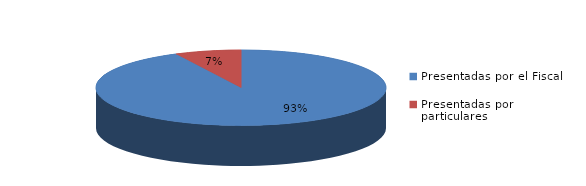
| Category | Series 0 |
|---|---|
| Presentadas por el Fiscal | 150 |
| Presentadas por particulares | 12 |